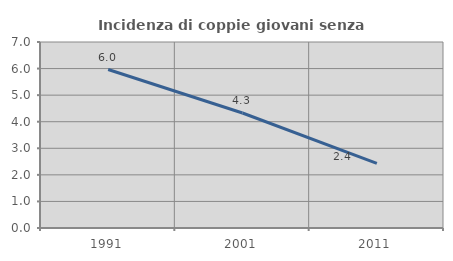
| Category | Incidenza di coppie giovani senza figli |
|---|---|
| 1991.0 | 5.963 |
| 2001.0 | 4.327 |
| 2011.0 | 2.433 |